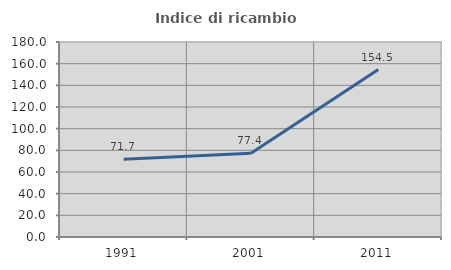
| Category | Indice di ricambio occupazionale  |
|---|---|
| 1991.0 | 71.739 |
| 2001.0 | 77.358 |
| 2011.0 | 154.545 |